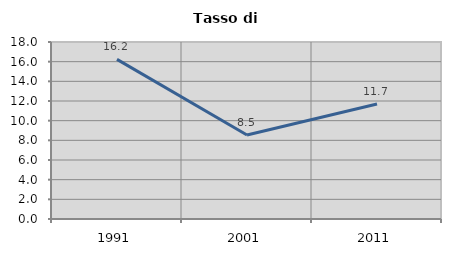
| Category | Tasso di disoccupazione   |
|---|---|
| 1991.0 | 16.23 |
| 2001.0 | 8.535 |
| 2011.0 | 11.698 |